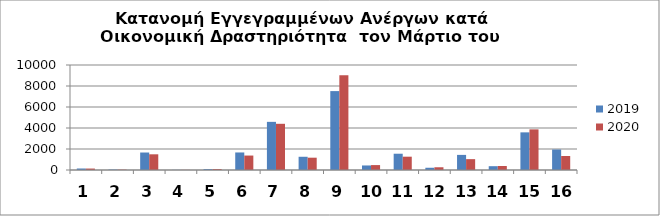
| Category | 2019 | 2020 |
|---|---|---|
| 0 | 143 | 138 |
| 1 | 41 | 34 |
| 2 | 1665 | 1495 |
| 3 | 11 | 12 |
| 4 | 83 | 87 |
| 5 | 1670 | 1376 |
| 6 | 4585 | 4400 |
| 7 | 1260 | 1172 |
| 8 | 7515 | 9028 |
| 9 | 432 | 468 |
| 10 | 1550 | 1268 |
| 11 | 214 | 261 |
| 12 | 1439 | 1034 |
| 13 | 363 | 379 |
| 14 | 3585 | 3869 |
| 15 | 1952 | 1332 |